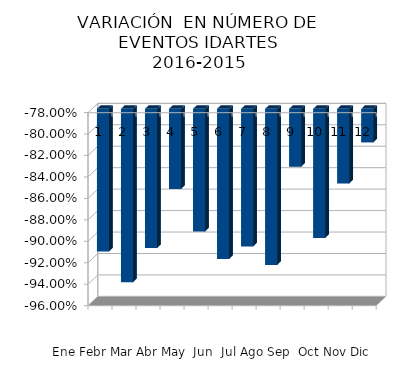
| Category | Series 0 |
|---|---|
| 0 | -0.913 |
| 1 | -0.942 |
| 2 | -0.91 |
| 3 | -0.855 |
| 4 | -0.894 |
| 5 | -0.92 |
| 6 | -0.908 |
| 7 | -0.926 |
| 8 | -0.834 |
| 9 | -0.9 |
| 10 | -0.85 |
| 11 | -0.811 |